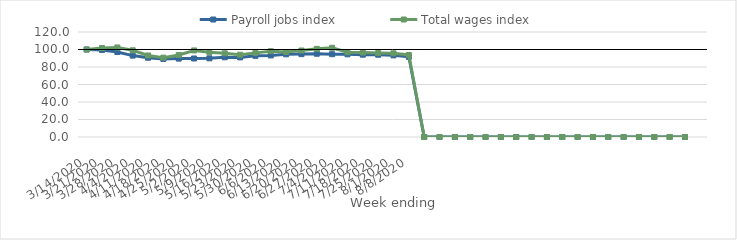
| Category | Payroll jobs index | Total wages index |
|---|---|---|
| 14/03/2020 | 100 | 100 |
| 21/03/2020 | 99.505 | 101.698 |
| 28/03/2020 | 97.111 | 102.33 |
| 04/04/2020 | 93.028 | 99.107 |
| 11/04/2020 | 90.586 | 93.166 |
| 18/04/2020 | 89.213 | 90.679 |
| 25/04/2020 | 89.581 | 93.758 |
| 02/05/2020 | 89.714 | 98.924 |
| 09/05/2020 | 89.898 | 96.857 |
| 16/05/2020 | 91.1 | 95.651 |
| 23/05/2020 | 90.993 | 94.002 |
| 30/05/2020 | 92.771 | 96.132 |
| 06/06/2020 | 93.222 | 98.053 |
| 13/06/2020 | 94.535 | 97.063 |
| 20/06/2020 | 94.724 | 98.833 |
| 27/06/2020 | 95.153 | 100.723 |
| 04/07/2020 | 94.629 | 101.999 |
| 11/07/2020 | 94.495 | 96.798 |
| 18/07/2020 | 94.081 | 96.513 |
| 25/07/2020 | 94.002 | 95.956 |
| 01/08/2020 | 93.288 | 95.695 |
| 08/08/2020 | 91.65 | 93.738 |